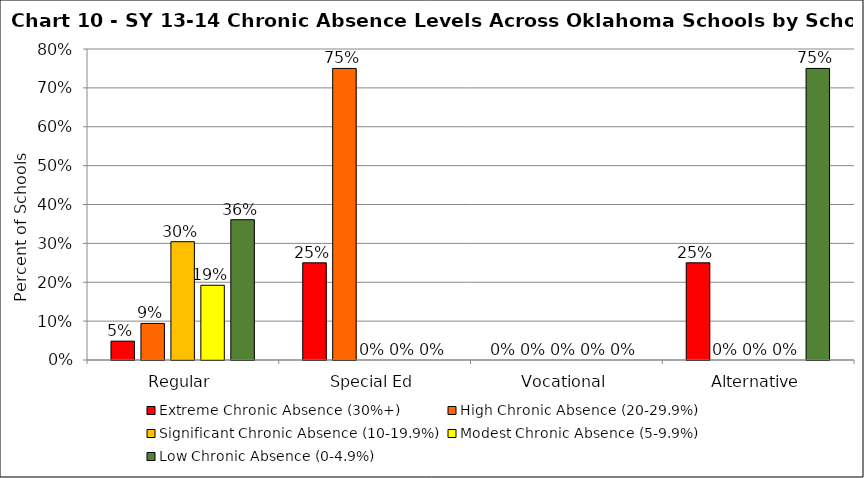
| Category | Extreme Chronic Absence (30%+) | High Chronic Absence (20-29.9%) | Significant Chronic Absence (10-19.9%) | Modest Chronic Absence (5-9.9%) | Low Chronic Absence (0-4.9%) |
|---|---|---|---|---|---|
| 0 | 0.048 | 0.094 | 0.304 | 0.192 | 0.361 |
| 1 | 0.25 | 0.75 | 0 | 0 | 0 |
| 2 | 0 | 0 | 0 | 0 | 0 |
| 3 | 0.25 | 0 | 0 | 0 | 0.75 |